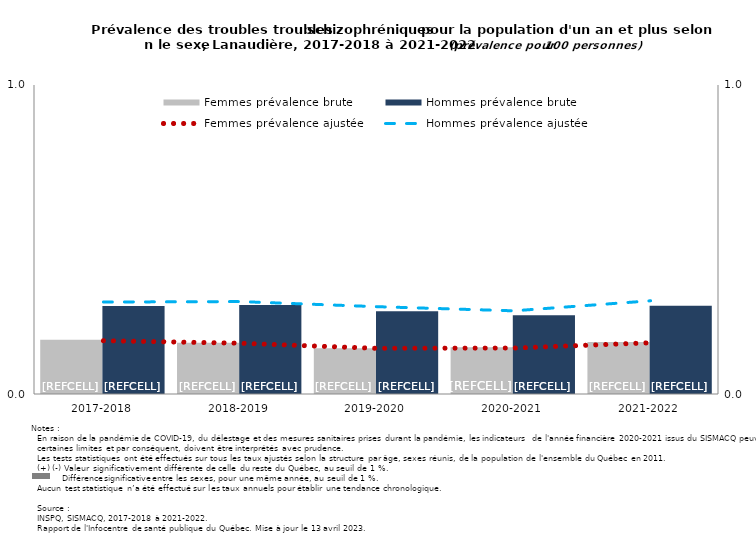
| Category | Femmes prévalence brute | Hommes prévalence brute |
|---|---|---|
| 2017-2018 | 0.175 | 0.285 |
| 2018-2019 | 0.166 | 0.288 |
| 2019-2020 | 0.148 | 0.268 |
| 2020-2021 | 0.151 | 0.255 |
| 2021-2022 | 0.169 | 0.286 |